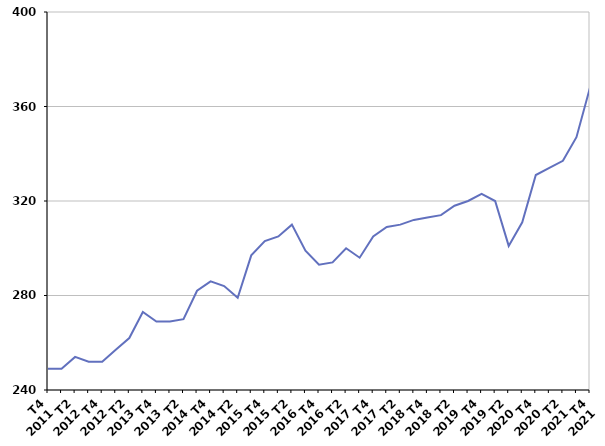
| Category | Durée moyenne d'inscription sur les listes des sortants |
|---|---|
| T4
2011 | 249 |
| T1
2012 | 249 |
| T2
2012 | 254 |
| T3
2012 | 252 |
| T4
2012 | 252 |
| T1
2013 | 257 |
| T2
2013 | 262 |
| T3
2013 | 273 |
| T4
2013 | 269 |
| T1
2014 | 269 |
| T2
2014 | 270 |
| T3
2014 | 282 |
| T4
2014 | 286 |
| T1
2015 | 284 |
| T2
2015 | 279 |
| T3
2015 | 297 |
| T4
2015 | 303 |
| T1
2016 | 305 |
| T2
2016 | 310 |
| T3
2016 | 299 |
| T4
2016 | 293 |
| T1
2017 | 294 |
| T2
2017 | 300 |
| T3
2017 | 296 |
| T4
2017 | 305 |
| T1
2018 | 309 |
| T2
2018 | 310 |
| T3
2018 | 312 |
| T4
2018 | 313 |
| T1
2019 | 314 |
| T2
2019 | 318 |
| T3
2019 | 320 |
| T4
2019 | 323 |
| T1
2020 | 320 |
| T2
2020 | 301 |
| T3
2020 | 311 |
| T4
2020 | 331 |
| T1
2021 | 334 |
| T2
2021 | 337 |
| T3
2021 | 347 |
| T4
2021 | 368 |